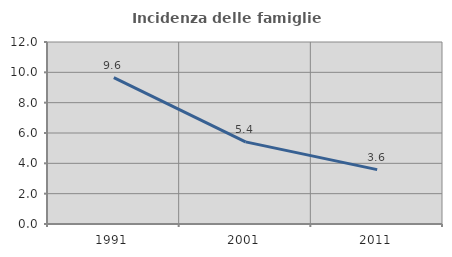
| Category | Incidenza delle famiglie numerose |
|---|---|
| 1991.0 | 9.647 |
| 2001.0 | 5.417 |
| 2011.0 | 3.586 |